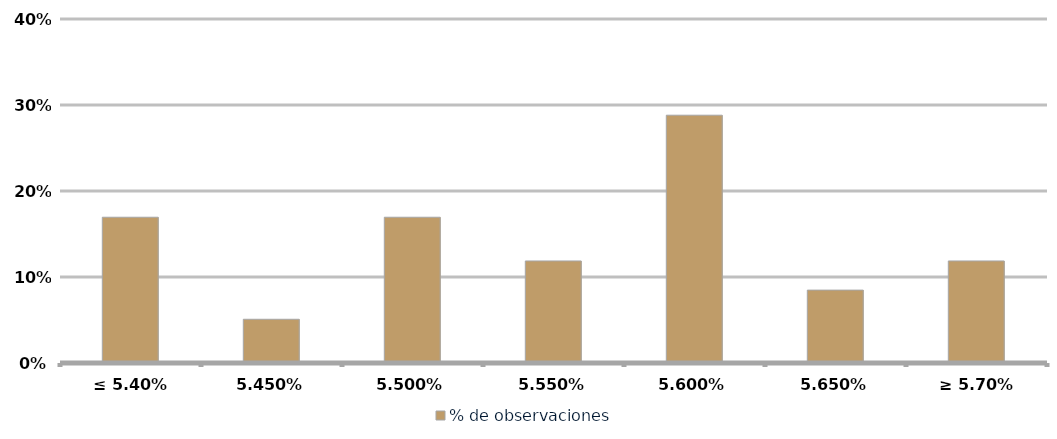
| Category | % de observaciones  |
|---|---|
| ≤ 5.40% | 0.169 |
| 5.45% | 0.051 |
| 5.50% | 0.169 |
| 5.55% | 0.119 |
| 5.60% | 0.288 |
| 5.65% | 0.085 |
| ≥ 5.70% | 0.119 |